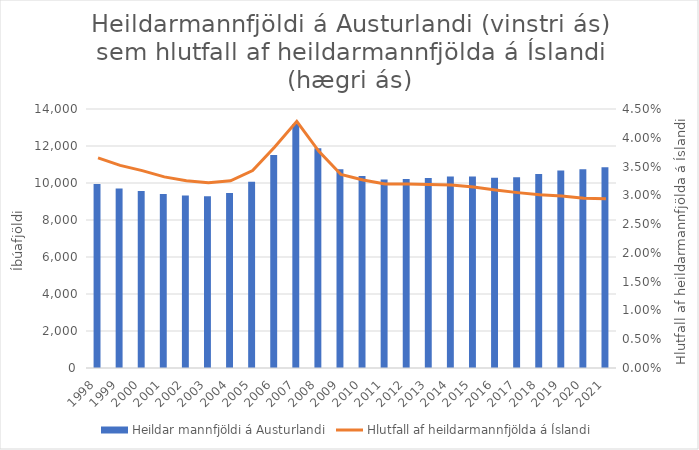
| Category | Heildar mannfjöldi á Austurlandi |
|---|---|
| 1998.0 | 9946 |
| 1999.0 | 9707 |
| 2000.0 | 9568 |
| 2001.0 | 9408 |
| 2002.0 | 9325 |
| 2003.0 | 9280 |
| 2004.0 | 9453 |
| 2005.0 | 10073 |
| 2006.0 | 11516 |
| 2007.0 | 13185 |
| 2008.0 | 11877 |
| 2009.0 | 10737 |
| 2010.0 | 10373 |
| 2011.0 | 10187 |
| 2012.0 | 10213 |
| 2013.0 | 10268 |
| 2014.0 | 10357 |
| 2015.0 | 10346 |
| 2016.0 | 10281 |
| 2017.0 | 10310 |
| 2018.0 | 10485 |
| 2019.0 | 10670 |
| 2020.0 | 10739 |
| 2021.0 | 10850 |